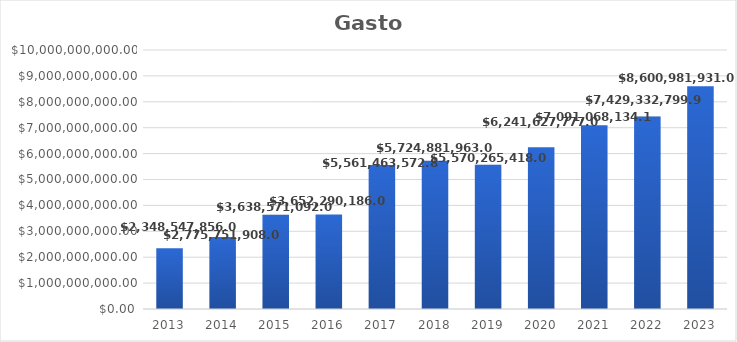
| Category | Series 0 |
|---|---|
| 2013.0 | 2348547856 |
| 2014.0 | 2775751908 |
| 2015.0 | 3638571092 |
| 2016.0 | 3652290186 |
| 2017.0 | 5561463572.87 |
| 2018.0 | 5724881963 |
| 2019.0 | 5570265418 |
| 2020.0 | 6241627777 |
| 2021.0 | 7091068134.1 |
| 2022.0 | 7429332799.93 |
| 2023.0 | 8600981931.06 |